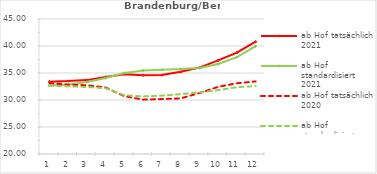
| Category | ab Hof tatsächlich 2021 | ab Hof standardisiert 2021 | ab Hof tatsächlich 2020 | ab Hof standardisiert 2020 |
|---|---|---|---|---|
| 0 | 33.401 | 32.707 | 33.129 | 32.634 |
| 1 | 33.497 | 32.863 | 32.837 | 32.545 |
| 2 | 33.681 | 33.343 | 32.732 | 32.406 |
| 3 | 34.26 | 34.067 | 32.318 | 32.173 |
| 4 | 34.772 | 35.003 | 30.717 | 30.879 |
| 5 | 34.593 | 35.446 | 30.065 | 30.66 |
| 6 | 34.61 | 35.613 | 30.168 | 30.813 |
| 7 | 35.216 | 35.721 | 30.298 | 31.086 |
| 8 | 35.989 | 35.945 | 31.278 | 31.391 |
| 9 | 37.333 | 36.667 | 32.429 | 31.826 |
| 10 | 38.78 | 37.931 | 33.103 | 32.376 |
| 11 | 40.797 | 39.964 | 33.438 | 32.581 |